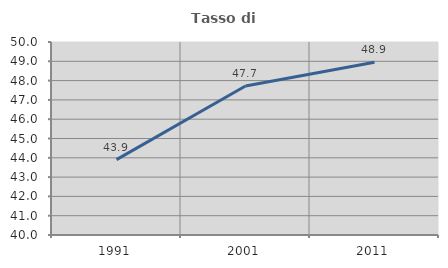
| Category | Tasso di occupazione   |
|---|---|
| 1991.0 | 43.904 |
| 2001.0 | 47.718 |
| 2011.0 | 48.947 |